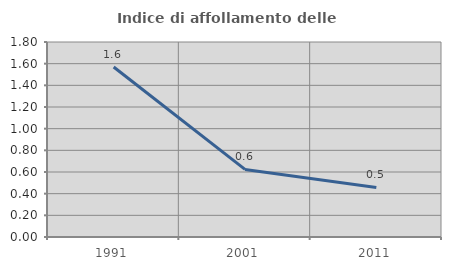
| Category | Indice di affollamento delle abitazioni  |
|---|---|
| 1991.0 | 1.57 |
| 2001.0 | 0.624 |
| 2011.0 | 0.457 |